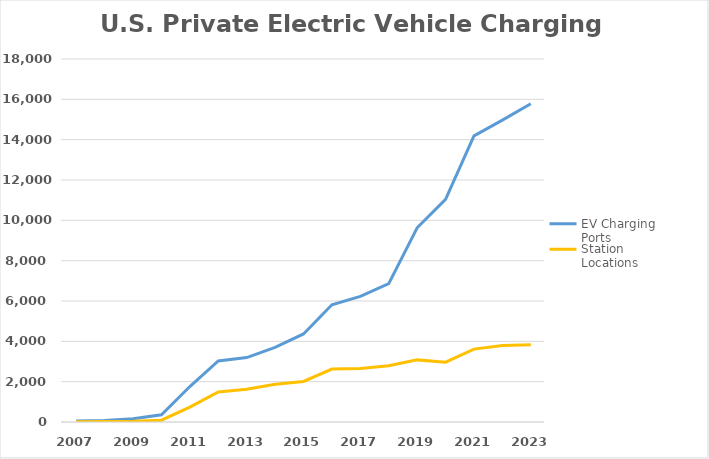
| Category | EV Charging Ports | Station Locations |
|---|---|---|
| 2007.0 | 53 | 17 |
| 2008.0 | 75 | 24 |
| 2009.0 | 161 | 40 |
| 2010.0 | 359 | 89 |
| 2011.0 | 1759 | 738 |
| 2012.0 | 3025 | 1491 |
| 2013.0 | 3196 | 1624 |
| 2014.0 | 3697 | 1867 |
| 2015.0 | 4365 | 2010 |
| 2016.0 | 5811 | 2628 |
| 2017.0 | 6232 | 2651 |
| 2018.0 | 6863 | 2786 |
| 2019.0 | 9631 | 3080 |
| 2020.0 | 11040 | 2965 |
| 2021.0 | 14189 | 3614 |
| 2022.0 | 14966 | 3789 |
| 2023.0 | 15780 | 3834 |